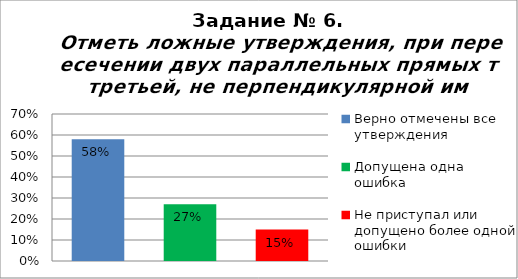
| Category | Отметь ложные утверждения, при пересечении двух параллельных прямых третьей, не перпендикулярной им. |
|---|---|
| Верно отмечены все утверждения | 0.58 |
| Допущена одна ошибка | 0.27 |
| Не приступал или допущено более одной ошибки | 0.15 |